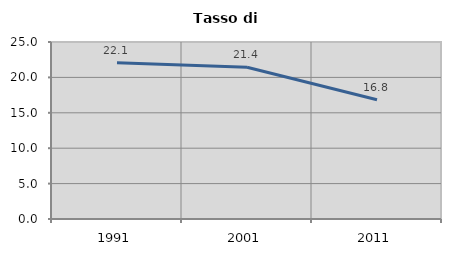
| Category | Tasso di disoccupazione   |
|---|---|
| 1991.0 | 22.059 |
| 2001.0 | 21.436 |
| 2011.0 | 16.835 |